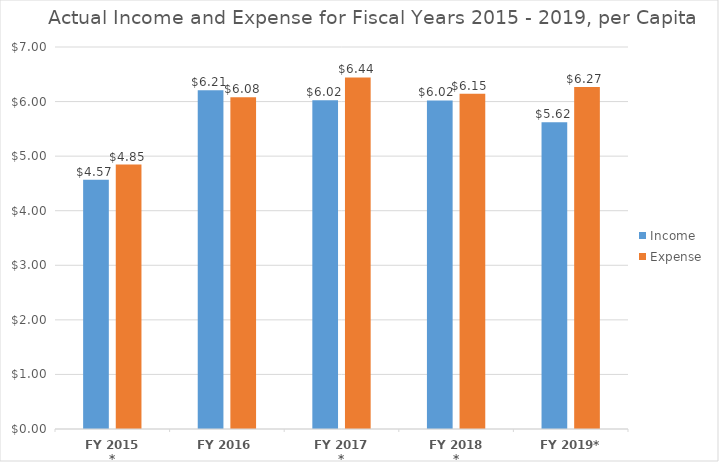
| Category | Income | Expense |
|---|---|---|
| FY 2015 * | 4.566 | 4.845 |
| FY 2016 | 6.209 | 6.08 |
| FY 2017 * | 6.023 | 6.441 |
| FY 2018 * | 6.021 | 6.146 |
| FY 2019* | 5.623 | 6.265 |